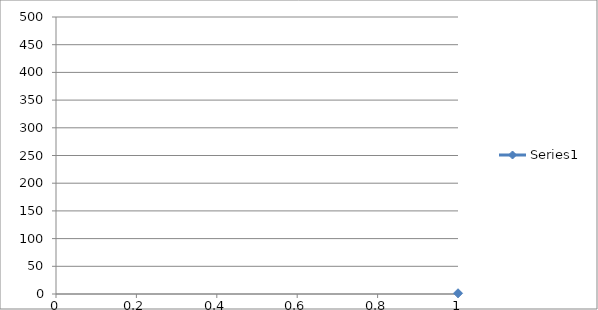
| Category | Series 0 |
|---|---|
| 0 | 1.353 |
| 1 | 1.19 |
| 2 | 1.178 |
| 3 | 1.247 |
| 4 | 1.326 |
| 5 | 1.412 |
| 6 | 1.509 |
| 7 | 1.616 |
| 8 | 1.731 |
| 9 | 1.872 |
| 10 | 2.033 |
| 11 | 2.195 |
| 12 | 2.384 |
| 13 | 2.597 |
| 14 | 2.832 |
| 15 | 3.091 |
| 16 | 3.41 |
| 17 | 3.758 |
| 18 | 4.182 |
| 19 | 4.673 |
| 20 | 5.218 |
| 21 | 5.869 |
| 22 | 6.626 |
| 23 | 8.044 |
| 24 | 9.306 |
| 25 | 10.742 |
| 26 | 12.45 |
| 27 | 14.979 |
| 28 | 17.803 |
| 29 | 21.607 |
| 30 | 26.692 |
| 31 | 29.051 |
| 32 | 31.631 |
| 33 | 34.38 |
| 34 | 37.56 |
| 35 | 41.588 |
| 36 | 45.698 |
| 37 | 50.165 |
| 38 | 54.959 |
| 39 | 60.68 |
| 40 | 67.308 |
| 41 | 74.425 |
| 42 | 82.449 |
| 43 | 91.292 |
| 44 | 101.045 |
| 45 | 111.865 |
| 46 | 123.695 |
| 47 | 136.945 |
| 48 | 150.895 |
| 49 | 166.038 |
| 50 | 181.719 |
| 51 | 199.052 |
| 52 | 216.531 |
| 53 | 234.715 |
| 54 | 253.476 |
| 55 | 271.855 |
| 56 | 290.495 |
| 57 | 309.21 |
| 58 | 327.185 |
| 59 | 344.166 |
| 60 | 360.435 |
| 61 | 375.751 |
| 62 | 389.693 |
| 63 | 402.494 |
| 64 | 413.896 |
| 65 | 424.165 |
| 66 | 433.215 |
| 67 | 440.746 |
| 68 | 447.755 |
| 69 | 453.326 |
| 70 | 457.65 |
| 71 | 461.594 |
| 72 | 464.34 |
| 73 | 466.896 |
| 74 | 468.279 |
| 75 | 469.604 |
| 76 | 470.041 |
| 77 | 470.537 |
| 78 | 470.91 |
| 79 | 471.123 |
| 80 | 471.21 |
| 81 | 471.186 |
| 82 | 471.056 |
| 83 | 470.795 |
| 84 | 470.317 |
| 85 | 469.613 |
| 86 | 468.085 |
| 87 | 466.457 |
| 88 | 463.95 |
| 89 | 461.073 |
| 90 | 457.458 |
| 91 | 452.453 |
| 92 | 446.772 |
| 93 | 440.263 |
| 94 | 432.278 |
| 95 | 422.879 |
| 96 | 412.85 |
| 97 | 401.078 |
| 98 | 388.068 |
| 99 | 374.304 |
| 100 | 359.031 |
| 101 | 342.672 |
| 102 | 325.526 |
| 103 | 307.855 |
| 104 | 289.75 |
| 105 | 270.894 |
| 106 | 252.064 |
| 107 | 233.872 |
| 108 | 215.513 |
| 109 | 197.684 |
| 110 | 180.637 |
| 111 | 164.716 |
| 112 | 149.964 |
| 113 | 136.132 |
| 114 | 123.374 |
| 115 | 111.335 |
| 116 | 101.083 |
| 117 | 91.157 |
| 118 | 82.414 |
| 119 | 74.53 |
| 120 | 67.084 |
| 121 | 60.935 |
| 122 | 55.145 |
| 123 | 49.984 |
| 124 | 45.765 |
| 125 | 41.613 |
| 126 | 38.172 |
| 127 | 34.527 |
| 128 | 31.935 |
| 129 | 29.241 |
| 130 | 26.835 |
| 131 | 22.411 |
| 132 | 18.453 |
| 133 | 15.608 |
| 134 | 13.081 |
| 135 | 11.384 |
| 136 | 9.758 |
| 137 | 8.4 |
| 138 | 7.726 |
| 139 | 6.932 |
| 140 | 6.173 |
| 141 | 5.52 |
| 142 | 4.949 |
| 143 | 4.475 |
| 144 | 4.028 |
| 145 | 3.693 |
| 146 | 3.361 |
| 147 | 3.094 |
| 148 | 2.863 |
| 149 | 2.631 |
| 150 | 2.451 |
| 151 | 2.275 |
| 152 | 2.144 |
| 153 | 2.008 |
| 154 | 1.89 |
| 155 | 1.765 |
| 156 | 1.661 |
| 157 | 1.554 |
| 158 | 1.495 |
| 159 | 1.432 |
| 160 | 1.369 |